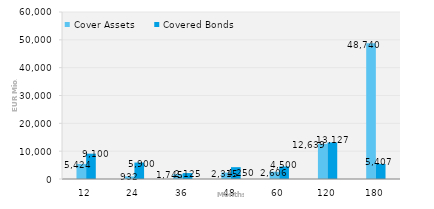
| Category | Cover Assets | Covered Bonds |
|---|---|---|
| 12.0 | 5423.79 | 9100 |
| 24.0 | 932.18 | 5900 |
| 36.0 | 1744.88 | 2125 |
| 48.0 | 2315.03 | 4250 |
| 60.0 | 2605.69 | 4500 |
| 120.0 | 12639.26 | 13127.2 |
| 180.0 | 48739.73 | 5407 |